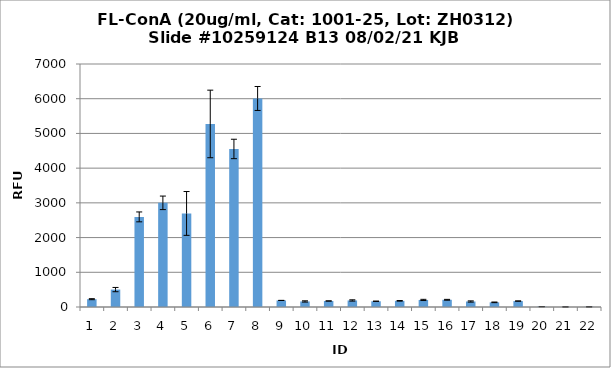
| Category | Series 0 |
|---|---|
| 0 | 225 |
| 1 | 502 |
| 2 | 2595.75 |
| 3 | 3000.5 |
| 4 | 2695.25 |
| 5 | 5273.25 |
| 6 | 4552.75 |
| 7 | 6007.25 |
| 8 | 189.25 |
| 9 | 160 |
| 10 | 173.25 |
| 11 | 188.75 |
| 12 | 165.5 |
| 13 | 177.5 |
| 14 | 203.25 |
| 15 | 207.75 |
| 16 | 158.75 |
| 17 | 134.5 |
| 18 | 170.75 |
| 19 | 9.25 |
| 20 | 2.75 |
| 21 | 4.5 |